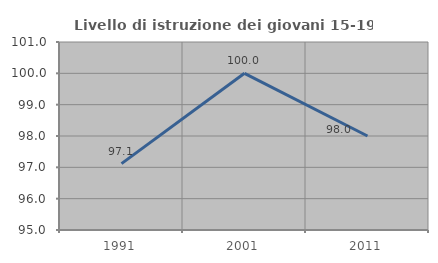
| Category | Livello di istruzione dei giovani 15-19 anni |
|---|---|
| 1991.0 | 97.119 |
| 2001.0 | 100 |
| 2011.0 | 98 |